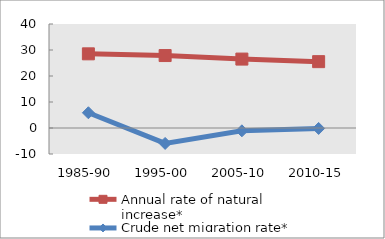
| Category | Annual rate of natural increase* | Crude net migration rate* |
|---|---|---|
| 1985-90 | 28.525 | 5.861 |
| 1995-00 | 27.861 | -5.937 |
| 2005-10 | 26.506 | -1.087 |
| 2010-15 | 25.521 | -0.172 |